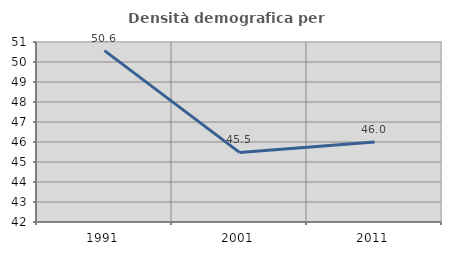
| Category | Densità demografica |
|---|---|
| 1991.0 | 50.566 |
| 2001.0 | 45.48 |
| 2011.0 | 46.003 |